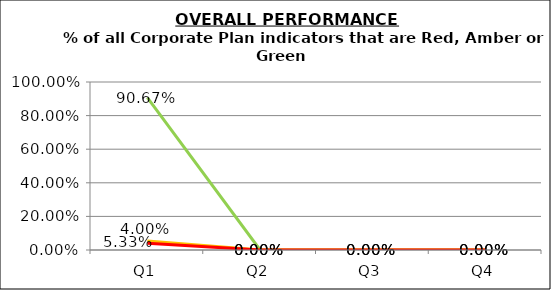
| Category | Green | Amber | Red |
|---|---|---|---|
| Q1 | 0.907 | 0.053 | 0.04 |
| Q2 | 0 | 0 | 0 |
| Q3 | 0 | 0 | 0 |
| Q4 | 0 | 0 | 0 |